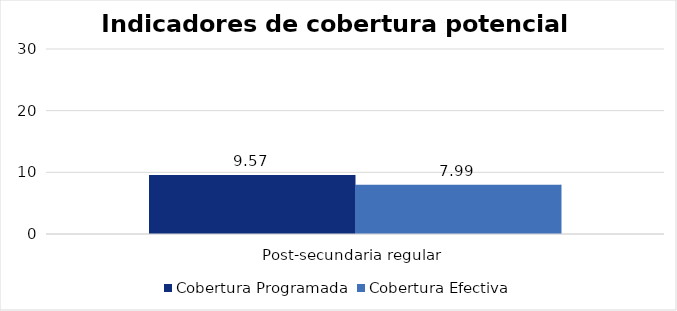
| Category | Cobertura Programada | Cobertura Efectiva |
|---|---|---|
| Post-secundaria regular  | 9.572 | 7.988 |